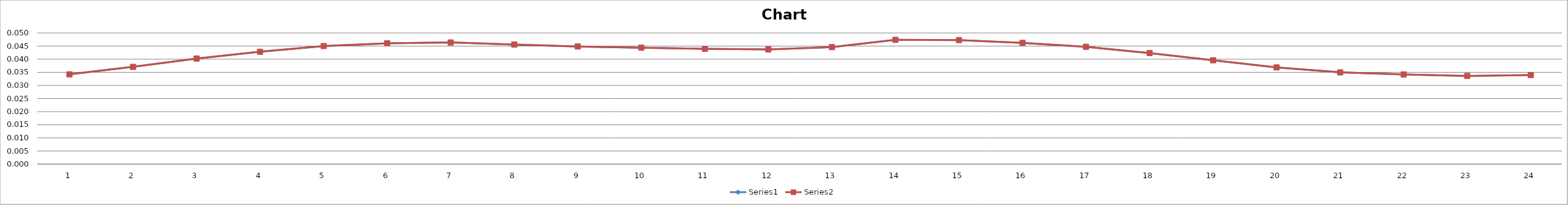
| Category | Series 0 | Series 1 |
|---|---|---|
| 0 | 0.034 | 0.034 |
| 1 | 0.037 | 0.037 |
| 2 | 0.04 | 0.04 |
| 3 | 0.043 | 0.043 |
| 4 | 0.045 | 0.045 |
| 5 | 0.046 | 0.046 |
| 6 | 0.046 | 0.046 |
| 7 | 0.046 | 0.046 |
| 8 | 0.045 | 0.045 |
| 9 | 0.044 | 0.044 |
| 10 | 0.044 | 0.044 |
| 11 | 0.044 | 0.044 |
| 12 | 0.045 | 0.045 |
| 13 | 0.047 | 0.047 |
| 14 | 0.047 | 0.047 |
| 15 | 0.046 | 0.046 |
| 16 | 0.045 | 0.045 |
| 17 | 0.042 | 0.042 |
| 18 | 0.04 | 0.04 |
| 19 | 0.037 | 0.037 |
| 20 | 0.035 | 0.035 |
| 21 | 0.034 | 0.034 |
| 22 | 0.034 | 0.034 |
| 23 | 0.034 | 0.034 |